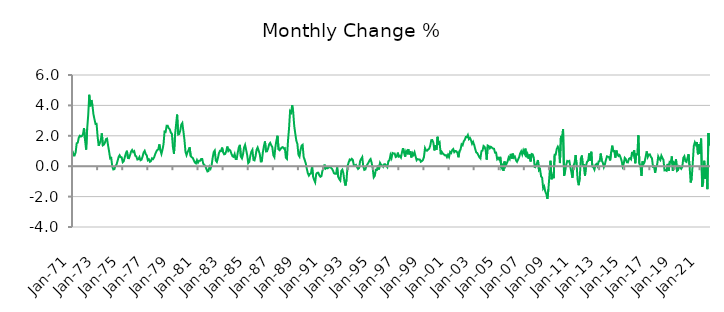
| Category | Series 0 |
|---|---|
| 1971-01-01 | 1.014 |
| 1971-02-01 | 0.711 |
| 1971-03-01 | 0.712 |
| 1971-04-01 | 0.919 |
| 1971-05-01 | 1.51 |
| 1971-06-01 | 1.551 |
| 1971-07-01 | 1.878 |
| 1971-08-01 | 2.005 |
| 1971-09-01 | 1.95 |
| 1971-10-01 | 1.987 |
| 1971-11-01 | 2.104 |
| 1971-12-01 | 2.509 |
| 1972-01-01 | 1.699 |
| 1972-02-01 | 1.094 |
| 1972-03-01 | 2.462 |
| 1972-04-01 | 3.36 |
| 1972-05-01 | 4.697 |
| 1972-06-01 | 3.937 |
| 1972-07-01 | 4.355 |
| 1972-08-01 | 4.026 |
| 1972-09-01 | 3.417 |
| 1972-10-01 | 3.088 |
| 1972-11-01 | 2.774 |
| 1972-12-01 | 2.784 |
| 1973-01-01 | 1.938 |
| 1973-02-01 | 1.343 |
| 1973-03-01 | 1.524 |
| 1973-04-01 | 1.712 |
| 1973-05-01 | 2.158 |
| 1973-06-01 | 1.373 |
| 1973-07-01 | 1.418 |
| 1973-08-01 | 1.551 |
| 1973-09-01 | 1.782 |
| 1973-10-01 | 1.816 |
| 1973-11-01 | 1.359 |
| 1973-12-01 | 0.961 |
| 1974-01-01 | 0.511 |
| 1974-02-01 | 0.548 |
| 1974-03-01 | -0.022 |
| 1974-04-01 | -0.216 |
| 1974-05-01 | -0.191 |
| 1974-06-01 | 0.007 |
| 1974-07-01 | 0.097 |
| 1974-08-01 | 0.326 |
| 1974-09-01 | 0.591 |
| 1974-10-01 | 0.722 |
| 1974-11-01 | 0.594 |
| 1974-12-01 | 0.583 |
| 1975-01-01 | 0.268 |
| 1975-02-01 | 0.337 |
| 1975-03-01 | 0.597 |
| 1975-04-01 | 0.845 |
| 1975-05-01 | 1.017 |
| 1975-06-01 | 0.539 |
| 1975-07-01 | 0.526 |
| 1975-08-01 | 0.722 |
| 1975-09-01 | 0.97 |
| 1975-10-01 | 1.067 |
| 1975-11-01 | 0.93 |
| 1975-12-01 | 0.985 |
| 1976-01-01 | 0.687 |
| 1976-02-01 | 0.643 |
| 1976-03-01 | 0.437 |
| 1976-04-01 | 0.463 |
| 1976-05-01 | 0.603 |
| 1976-06-01 | 0.392 |
| 1976-07-01 | 0.432 |
| 1976-08-01 | 0.636 |
| 1976-09-01 | 0.905 |
| 1976-10-01 | 1.011 |
| 1976-11-01 | 0.8 |
| 1976-12-01 | 0.709 |
| 1977-01-01 | 0.392 |
| 1977-02-01 | 0.448 |
| 1977-03-01 | 0.289 |
| 1977-04-01 | 0.338 |
| 1977-05-01 | 0.521 |
| 1977-06-01 | 0.47 |
| 1977-07-01 | 0.575 |
| 1977-08-01 | 0.784 |
| 1977-09-01 | 0.951 |
| 1977-10-01 | 1.061 |
| 1977-11-01 | 1.111 |
| 1977-12-01 | 1.434 |
| 1978-01-01 | 1.05 |
| 1978-02-01 | 0.811 |
| 1978-03-01 | 1.084 |
| 1978-04-01 | 1.443 |
| 1978-05-01 | 2.28 |
| 1978-06-01 | 2.255 |
| 1978-07-01 | 2.668 |
| 1978-08-01 | 2.665 |
| 1978-09-01 | 2.498 |
| 1978-10-01 | 2.424 |
| 1978-11-01 | 2.207 |
| 1978-12-01 | 2.133 |
| 1979-01-01 | 1.242 |
| 1979-02-01 | 0.823 |
| 1979-03-01 | 2.034 |
| 1979-04-01 | 2.732 |
| 1979-05-01 | 3.394 |
| 1979-06-01 | 2.083 |
| 1979-07-01 | 2.118 |
| 1979-08-01 | 2.335 |
| 1979-09-01 | 2.734 |
| 1979-10-01 | 2.841 |
| 1979-11-01 | 2.3 |
| 1979-12-01 | 1.747 |
| 1980-01-01 | 0.943 |
| 1980-02-01 | 0.726 |
| 1980-03-01 | 0.925 |
| 1980-04-01 | 1.073 |
| 1980-05-01 | 1.242 |
| 1980-06-01 | 0.656 |
| 1980-07-01 | 0.591 |
| 1980-08-01 | 0.543 |
| 1980-09-01 | 0.381 |
| 1980-10-01 | 0.243 |
| 1980-11-01 | 0.186 |
| 1980-12-01 | 0.395 |
| 1981-01-01 | 0.234 |
| 1981-02-01 | 0.354 |
| 1981-03-01 | 0.354 |
| 1981-04-01 | 0.474 |
| 1981-05-01 | 0.478 |
| 1981-06-01 | 0.161 |
| 1981-07-01 | 0.077 |
| 1981-08-01 | 0.019 |
| 1981-09-01 | -0.188 |
| 1981-10-01 | -0.344 |
| 1981-11-01 | -0.317 |
| 1981-12-01 | -0.035 |
| 1982-01-01 | -0.155 |
| 1982-02-01 | 0.068 |
| 1982-03-01 | 0.555 |
| 1982-04-01 | 0.929 |
| 1982-05-01 | 1.031 |
| 1982-06-01 | 0.372 |
| 1982-07-01 | 0.28 |
| 1982-08-01 | 0.532 |
| 1982-09-01 | 0.859 |
| 1982-10-01 | 1.012 |
| 1982-11-01 | 0.998 |
| 1982-12-01 | 1.225 |
| 1983-01-01 | 0.92 |
| 1983-02-01 | 0.783 |
| 1983-03-01 | 0.81 |
| 1983-04-01 | 0.995 |
| 1983-05-01 | 1.293 |
| 1983-06-01 | 1.001 |
| 1983-07-01 | 1.08 |
| 1983-08-01 | 1.015 |
| 1983-09-01 | 0.803 |
| 1983-10-01 | 0.652 |
| 1983-11-01 | 0.611 |
| 1983-12-01 | 0.798 |
| 1984-01-01 | 0.473 |
| 1984-02-01 | 0.478 |
| 1984-03-01 | 0.903 |
| 1984-04-01 | 1.241 |
| 1984-05-01 | 1.404 |
| 1984-06-01 | 0.614 |
| 1984-07-01 | 0.511 |
| 1984-08-01 | 0.774 |
| 1984-09-01 | 1.225 |
| 1984-10-01 | 1.401 |
| 1984-11-01 | 1.068 |
| 1984-12-01 | 0.734 |
| 1985-01-01 | 0.202 |
| 1985-02-01 | 0.279 |
| 1985-03-01 | 0.684 |
| 1985-04-01 | 0.954 |
| 1985-05-01 | 1.079 |
| 1985-06-01 | 0.413 |
| 1985-07-01 | 0.38 |
| 1985-08-01 | 0.656 |
| 1985-09-01 | 1.087 |
| 1985-10-01 | 1.228 |
| 1985-11-01 | 1.02 |
| 1985-12-01 | 0.807 |
| 1986-01-01 | 0.311 |
| 1986-02-01 | 0.317 |
| 1986-03-01 | 0.923 |
| 1986-04-01 | 1.322 |
| 1986-05-01 | 1.629 |
| 1986-06-01 | 0.97 |
| 1986-07-01 | 0.982 |
| 1986-08-01 | 1.161 |
| 1986-09-01 | 1.443 |
| 1986-10-01 | 1.536 |
| 1986-11-01 | 1.373 |
| 1986-12-01 | 1.263 |
| 1987-01-01 | 0.724 |
| 1987-02-01 | 0.595 |
| 1987-03-01 | 1.283 |
| 1987-04-01 | 1.705 |
| 1987-05-01 | 2.003 |
| 1987-06-01 | 1.108 |
| 1987-07-01 | 1.049 |
| 1987-08-01 | 1.142 |
| 1987-09-01 | 1.226 |
| 1987-10-01 | 1.253 |
| 1987-11-01 | 1.16 |
| 1987-12-01 | 1.188 |
| 1988-01-01 | 0.558 |
| 1988-02-01 | 0.478 |
| 1988-03-01 | 1.666 |
| 1988-04-01 | 2.466 |
| 1988-05-01 | 3.62 |
| 1988-06-01 | 3.526 |
| 1988-07-01 | 4.01 |
| 1988-08-01 | 3.546 |
| 1988-09-01 | 2.637 |
| 1988-10-01 | 2.133 |
| 1988-11-01 | 1.68 |
| 1988-12-01 | 1.467 |
| 1989-01-01 | 0.756 |
| 1989-02-01 | 0.634 |
| 1989-03-01 | 1.069 |
| 1989-04-01 | 1.347 |
| 1989-05-01 | 1.408 |
| 1989-06-01 | 0.607 |
| 1989-07-01 | 0.411 |
| 1989-08-01 | 0.192 |
| 1989-09-01 | -0.165 |
| 1989-10-01 | -0.462 |
| 1989-11-01 | -0.618 |
| 1989-12-01 | -0.507 |
| 1990-01-01 | -0.459 |
| 1990-02-01 | -0.019 |
| 1990-03-01 | -0.686 |
| 1990-04-01 | -0.897 |
| 1990-05-01 | -1.058 |
| 1990-06-01 | -0.51 |
| 1990-07-01 | -0.437 |
| 1990-08-01 | -0.428 |
| 1990-09-01 | -0.604 |
| 1990-10-01 | -0.695 |
| 1990-11-01 | -0.649 |
| 1990-12-01 | -0.278 |
| 1991-01-01 | -0.196 |
| 1991-02-01 | 0.105 |
| 1991-03-01 | -0.159 |
| 1991-04-01 | -0.105 |
| 1991-05-01 | -0.139 |
| 1991-06-01 | -0.062 |
| 1991-07-01 | -0.066 |
| 1991-08-01 | -0.093 |
| 1991-09-01 | -0.159 |
| 1991-10-01 | -0.285 |
| 1991-11-01 | -0.467 |
| 1991-12-01 | -0.497 |
| 1992-01-01 | -0.494 |
| 1992-02-01 | -0.076 |
| 1992-03-01 | -0.697 |
| 1992-04-01 | -0.848 |
| 1992-05-01 | -0.944 |
| 1992-06-01 | -0.312 |
| 1992-07-01 | -0.225 |
| 1992-08-01 | -0.473 |
| 1992-09-01 | -1.015 |
| 1992-10-01 | -1.272 |
| 1992-11-01 | -0.873 |
| 1992-12-01 | 0.026 |
| 1993-01-01 | 0.247 |
| 1993-02-01 | 0.437 |
| 1993-03-01 | 0.391 |
| 1993-04-01 | 0.487 |
| 1993-05-01 | 0.413 |
| 1993-06-01 | 0.047 |
| 1993-07-01 | 0.03 |
| 1993-08-01 | 0.082 |
| 1993-09-01 | -0.063 |
| 1993-10-01 | -0.18 |
| 1993-11-01 | -0.118 |
| 1993-12-01 | 0.35 |
| 1994-01-01 | 0.48 |
| 1994-02-01 | 0.595 |
| 1994-03-01 | -0.023 |
| 1994-04-01 | -0.241 |
| 1994-05-01 | -0.212 |
| 1994-06-01 | 0.019 |
| 1994-07-01 | 0.12 |
| 1994-08-01 | 0.247 |
| 1994-09-01 | 0.391 |
| 1994-10-01 | 0.472 |
| 1994-11-01 | 0.222 |
| 1994-12-01 | -0.131 |
| 1995-01-01 | -0.733 |
| 1995-02-01 | -0.635 |
| 1995-03-01 | -0.24 |
| 1995-04-01 | -0.251 |
| 1995-05-01 | 0.043 |
| 1995-06-01 | -0.212 |
| 1995-07-01 | 0.218 |
| 1995-08-01 | 0.097 |
| 1995-09-01 | 0.057 |
| 1995-10-01 | -0.036 |
| 1995-11-01 | 0.126 |
| 1995-12-01 | 0.123 |
| 1996-01-01 | 0.036 |
| 1996-02-01 | -0.061 |
| 1996-03-01 | 0.33 |
| 1996-04-01 | 0.389 |
| 1996-05-01 | 0.736 |
| 1996-06-01 | 0.535 |
| 1996-07-01 | 0.868 |
| 1996-08-01 | 0.833 |
| 1996-09-01 | 0.834 |
| 1996-10-01 | 0.603 |
| 1996-11-01 | 0.635 |
| 1996-12-01 | 0.892 |
| 1997-01-01 | 0.634 |
| 1997-02-01 | 0.672 |
| 1997-03-01 | 0.57 |
| 1997-04-01 | 0.919 |
| 1997-05-01 | 1.19 |
| 1997-06-01 | 0.893 |
| 1997-07-01 | 0.625 |
| 1997-08-01 | 0.99 |
| 1997-09-01 | 0.877 |
| 1997-10-01 | 1.126 |
| 1997-11-01 | 0.779 |
| 1997-12-01 | 0.981 |
| 1998-01-01 | 0.576 |
| 1998-02-01 | 0.861 |
| 1998-03-01 | 0.744 |
| 1998-04-01 | 0.917 |
| 1998-05-01 | 0.646 |
| 1998-06-01 | 0.394 |
| 1998-07-01 | 0.47 |
| 1998-08-01 | 0.438 |
| 1998-09-01 | 0.441 |
| 1998-10-01 | 0.291 |
| 1998-11-01 | 0.339 |
| 1998-12-01 | 0.406 |
| 1999-01-01 | 0.599 |
| 1999-02-01 | 1.189 |
| 1999-03-01 | 1.036 |
| 1999-04-01 | 1.017 |
| 1999-05-01 | 1.102 |
| 1999-06-01 | 1.154 |
| 1999-07-01 | 1.343 |
| 1999-08-01 | 1.715 |
| 1999-09-01 | 1.719 |
| 1999-10-01 | 1.552 |
| 1999-11-01 | 1.038 |
| 1999-12-01 | 1.38 |
| 2000-01-01 | 1.085 |
| 2000-02-01 | 1.936 |
| 2000-03-01 | 1.491 |
| 2000-04-01 | 1.566 |
| 2000-05-01 | 0.781 |
| 2000-06-01 | 0.949 |
| 2000-07-01 | 0.839 |
| 2000-08-01 | 0.775 |
| 2000-09-01 | 0.714 |
| 2000-10-01 | 0.729 |
| 2000-11-01 | 0.596 |
| 2000-12-01 | 0.754 |
| 2001-01-01 | 0.606 |
| 2001-02-01 | 0.935 |
| 2001-03-01 | 0.867 |
| 2001-04-01 | 1.055 |
| 2001-05-01 | 1.127 |
| 2001-06-01 | 0.924 |
| 2001-07-01 | 0.998 |
| 2001-08-01 | 0.985 |
| 2001-09-01 | 0.883 |
| 2001-10-01 | 0.588 |
| 2001-11-01 | 0.997 |
| 2001-12-01 | 1.094 |
| 2002-01-01 | 1.445 |
| 2002-02-01 | 1.384 |
| 2002-03-01 | 1.631 |
| 2002-04-01 | 1.728 |
| 2002-05-01 | 1.918 |
| 2002-06-01 | 1.906 |
| 2002-07-01 | 2.048 |
| 2002-08-01 | 1.783 |
| 2002-09-01 | 1.859 |
| 2002-10-01 | 1.71 |
| 2002-11-01 | 1.477 |
| 2002-12-01 | 1.602 |
| 2003-01-01 | 1.407 |
| 2003-02-01 | 1.139 |
| 2003-03-01 | 0.91 |
| 2003-04-01 | 0.863 |
| 2003-05-01 | 0.726 |
| 2003-06-01 | 0.579 |
| 2003-07-01 | 0.508 |
| 2003-08-01 | 0.993 |
| 2003-09-01 | 1.027 |
| 2003-10-01 | 1.329 |
| 2003-11-01 | 1.273 |
| 2003-12-01 | 1.053 |
| 2004-01-01 | 0.433 |
| 2004-02-01 | 1.358 |
| 2004-03-01 | 1.317 |
| 2004-04-01 | 1.179 |
| 2004-05-01 | 1.278 |
| 2004-06-01 | 1.218 |
| 2004-07-01 | 1.163 |
| 2004-08-01 | 1.146 |
| 2004-09-01 | 0.887 |
| 2004-10-01 | 0.892 |
| 2004-11-01 | 0.464 |
| 2004-12-01 | 0.546 |
| 2005-01-01 | 0.433 |
| 2005-02-01 | 0.615 |
| 2005-03-01 | -0.094 |
| 2005-04-01 | 0.035 |
| 2005-05-01 | -0.308 |
| 2005-06-01 | 0.31 |
| 2005-07-01 | 0.014 |
| 2005-08-01 | 0.163 |
| 2005-09-01 | 0.324 |
| 2005-10-01 | 0.577 |
| 2005-11-01 | 0.466 |
| 2005-12-01 | 0.812 |
| 2006-01-01 | 0.5 |
| 2006-02-01 | 0.828 |
| 2006-03-01 | 0.563 |
| 2006-04-01 | 0.621 |
| 2006-05-01 | 0.386 |
| 2006-06-01 | 0.291 |
| 2006-07-01 | 0.438 |
| 2006-08-01 | 0.591 |
| 2006-09-01 | 0.848 |
| 2006-10-01 | 0.979 |
| 2006-11-01 | 0.775 |
| 2006-12-01 | 1.037 |
| 2007-01-01 | 0.858 |
| 2007-02-01 | 1.157 |
| 2007-03-01 | 0.591 |
| 2007-04-01 | 0.791 |
| 2007-05-01 | 0.495 |
| 2007-06-01 | 0.773 |
| 2007-07-01 | 0.314 |
| 2007-08-01 | 0.802 |
| 2007-09-01 | 0.779 |
| 2007-10-01 | 0.566 |
| 2007-11-01 | -0.121 |
| 2007-12-01 | 0.07 |
| 2008-01-01 | 0.193 |
| 2008-02-01 | 0.407 |
| 2008-03-01 | -0.27 |
| 2008-04-01 | -0.198 |
| 2008-05-01 | -0.666 |
| 2008-06-01 | -0.763 |
| 2008-07-01 | -1.456 |
| 2008-08-01 | -1.333 |
| 2008-09-01 | -1.666 |
| 2008-10-01 | -1.827 |
| 2008-11-01 | -2.152 |
| 2008-12-01 | -1.511 |
| 2009-01-01 | -0.593 |
| 2009-02-01 | 0.356 |
| 2009-03-01 | -0.862 |
| 2009-04-01 | -0.536 |
| 2009-05-01 | -0.786 |
| 2009-06-01 | 0.762 |
| 2009-07-01 | 0.77 |
| 2009-08-01 | 1.139 |
| 2009-09-01 | 1.284 |
| 2009-10-01 | 1.145 |
| 2009-11-01 | 0.204 |
| 2009-12-01 | 1.994 |
| 2010-01-01 | 1.613 |
| 2010-02-01 | 2.445 |
| 2010-03-01 | -0.631 |
| 2010-04-01 | -0.337 |
| 2010-05-01 | 0.08 |
| 2010-06-01 | 0.344 |
| 2010-07-01 | 0.307 |
| 2010-08-01 | 0.345 |
| 2010-09-01 | -0.055 |
| 2010-10-01 | -0.41 |
| 2010-11-01 | -0.762 |
| 2010-12-01 | 0.039 |
| 2011-01-01 | 0.213 |
| 2011-02-01 | 0.73 |
| 2011-03-01 | 0.086 |
| 2011-04-01 | -0.954 |
| 2011-05-01 | -1.249 |
| 2011-06-01 | -0.74 |
| 2011-07-01 | 0.505 |
| 2011-08-01 | 0.701 |
| 2011-09-01 | -0.047 |
| 2011-10-01 | 0.117 |
| 2011-11-01 | -0.617 |
| 2011-12-01 | 0.055 |
| 2012-01-01 | 0.295 |
| 2012-02-01 | 0.36 |
| 2012-03-01 | 0.843 |
| 2012-04-01 | 0.364 |
| 2012-05-01 | 0.952 |
| 2012-06-01 | -0.019 |
| 2012-07-01 | -0.072 |
| 2012-08-01 | -0.223 |
| 2012-09-01 | 0.09 |
| 2012-10-01 | 0.146 |
| 2012-11-01 | 0.01 |
| 2012-12-01 | 0.315 |
| 2013-01-01 | 0.332 |
| 2013-02-01 | 0.833 |
| 2013-03-01 | 0.377 |
| 2013-04-01 | 0.245 |
| 2013-05-01 | -0.058 |
| 2013-06-01 | 0.126 |
| 2013-07-01 | 0.41 |
| 2013-08-01 | 0.651 |
| 2013-09-01 | 0.62 |
| 2013-10-01 | 0.603 |
| 2013-11-01 | 0.38 |
| 2013-12-01 | 0.926 |
| 2014-01-01 | 1.351 |
| 2014-02-01 | 0.99 |
| 2014-03-01 | 1.002 |
| 2014-04-01 | 0.559 |
| 2014-05-01 | 1.028 |
| 2014-06-01 | 0.79 |
| 2014-07-01 | 0.675 |
| 2014-08-01 | 0.734 |
| 2014-09-01 | 0.578 |
| 2014-10-01 | 0.359 |
| 2014-11-01 | -0.016 |
| 2014-12-01 | 0.161 |
| 2015-01-01 | 0.547 |
| 2015-02-01 | 0.467 |
| 2015-03-01 | 0.257 |
| 2015-04-01 | 0.25 |
| 2015-05-01 | 0.484 |
| 2015-06-01 | 0.532 |
| 2015-07-01 | 0.454 |
| 2015-08-01 | 0.94 |
| 2015-09-01 | 0.754 |
| 2015-10-01 | 1.045 |
| 2015-11-01 | 0.196 |
| 2015-12-01 | 0.79 |
| 2016-01-01 | 0.777 |
| 2016-02-01 | 2.042 |
| 2016-03-01 | 0.162 |
| 2016-04-01 | 0.005 |
| 2016-05-01 | -0.638 |
| 2016-06-01 | 0.315 |
| 2016-07-01 | 0.149 |
| 2016-08-01 | 0.276 |
| 2016-09-01 | 0.638 |
| 2016-10-01 | 0.971 |
| 2016-11-01 | 0.611 |
| 2016-12-01 | 0.773 |
| 2017-01-01 | 0.778 |
| 2017-02-01 | 0.608 |
| 2017-03-01 | 0.525 |
| 2017-04-01 | -0.033 |
| 2017-05-01 | -0.003 |
| 2017-06-01 | -0.431 |
| 2017-07-01 | -0.06 |
| 2017-08-01 | 0.117 |
| 2017-09-01 | 0.643 |
| 2017-10-01 | 0.49 |
| 2017-11-01 | 0.401 |
| 2017-12-01 | 0.694 |
| 2018-01-01 | 0.543 |
| 2018-02-01 | 0.408 |
| 2018-03-01 | -0.275 |
| 2018-04-01 | -0.266 |
| 2018-05-01 | -0.302 |
| 2018-06-01 | 0.152 |
| 2018-07-01 | -0.316 |
| 2018-08-01 | 0.283 |
| 2018-09-01 | 0.257 |
| 2018-10-01 | 0.643 |
| 2018-11-01 | -0.297 |
| 2018-12-01 | 0.233 |
| 2019-01-01 | 0.149 |
| 2019-02-01 | 0.449 |
| 2019-03-01 | -0.311 |
| 2019-04-01 | -0.253 |
| 2019-05-01 | -0.005 |
| 2019-06-01 | -0.066 |
| 2019-07-01 | -0.17 |
| 2019-08-01 | -0.053 |
| 2019-09-01 | 0.55 |
| 2019-10-01 | 0.654 |
| 2019-11-01 | 0.326 |
| 2019-12-01 | 0.284 |
| 2020-01-01 | 0.554 |
| 2020-02-01 | 0.789 |
| 2020-03-01 | -0.028 |
| 2020-04-01 | -1.07 |
| 2020-05-01 | -0.822 |
| 2020-06-01 | 0.206 |
| 2020-07-01 | 1.328 |
| 2020-08-01 | 1.569 |
| 2020-09-01 | 1.411 |
| 2020-10-01 | 1.591 |
| 2020-11-01 | 0.787 |
| 2020-12-01 | 1.444 |
| 2021-01-01 | 0.821 |
| 2021-02-01 | 1.813 |
| 2021-03-01 | -1.354 |
| 2021-04-01 | -1.055 |
| 2021-05-01 | 0.356 |
| 2021-06-01 | -0.826 |
| 2021-07-01 | 0.071 |
| 2021-08-01 | -1.508 |
| 2021-09-01 | 2.183 |
| 2021-10-01 | 1.36 |